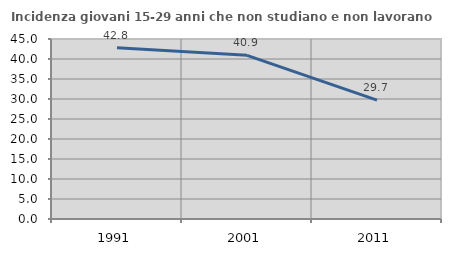
| Category | Incidenza giovani 15-29 anni che non studiano e non lavorano  |
|---|---|
| 1991.0 | 42.839 |
| 2001.0 | 40.923 |
| 2011.0 | 29.716 |